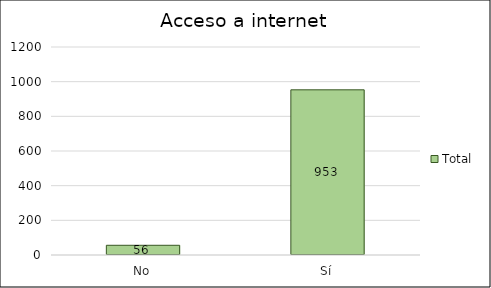
| Category | Total |
|---|---|
| No | 56 |
| Sí | 953 |